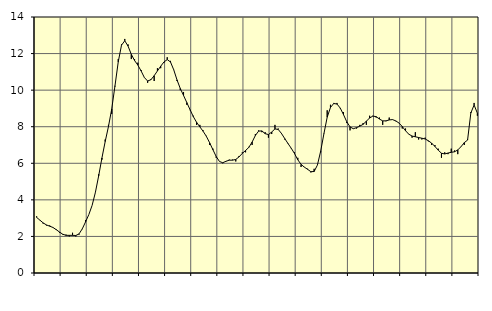
| Category | Piggar | Series 1 |
|---|---|---|
| nan | 3.1 | 3.04 |
| 87.0 | 2.9 | 2.89 |
| 87.0 | 2.7 | 2.74 |
| 87.0 | 2.6 | 2.63 |
| nan | 2.6 | 2.56 |
| 88.0 | 2.5 | 2.49 |
| 88.0 | 2.4 | 2.37 |
| 88.0 | 2.2 | 2.24 |
| nan | 2.1 | 2.12 |
| 89.0 | 2.1 | 2.06 |
| 89.0 | 2 | 2.06 |
| 89.0 | 2.2 | 2.06 |
| nan | 2 | 2.05 |
| 90.0 | 2.1 | 2.14 |
| 90.0 | 2.4 | 2.42 |
| 90.0 | 2.9 | 2.8 |
| nan | 3.2 | 3.2 |
| 91.0 | 3.7 | 3.7 |
| 91.0 | 4.4 | 4.41 |
| 91.0 | 5.4 | 5.31 |
| nan | 6.2 | 6.29 |
| 92.0 | 7.3 | 7.19 |
| 92.0 | 8.1 | 8.01 |
| 92.0 | 8.7 | 8.97 |
| nan | 10.2 | 10.24 |
| 93.0 | 11.7 | 11.55 |
| 93.0 | 12.5 | 12.46 |
| 93.0 | 12.8 | 12.7 |
| nan | 12.5 | 12.41 |
| 94.0 | 11.7 | 11.96 |
| 94.0 | 11.7 | 11.62 |
| 94.0 | 11.5 | 11.37 |
| nan | 11.1 | 11.05 |
| 95.0 | 10.7 | 10.69 |
| 95.0 | 10.4 | 10.5 |
| 95.0 | 10.6 | 10.57 |
| nan | 10.5 | 10.79 |
| 96.0 | 11.2 | 11.05 |
| 96.0 | 11.2 | 11.31 |
| 96.0 | 11.5 | 11.54 |
| nan | 11.8 | 11.67 |
| 97.0 | 11.6 | 11.54 |
| 97.0 | 11.1 | 11.11 |
| 97.0 | 10.5 | 10.56 |
| nan | 10 | 10.09 |
| 98.0 | 9.9 | 9.71 |
| 98.0 | 9.2 | 9.32 |
| 98.0 | 8.9 | 8.93 |
| nan | 8.6 | 8.55 |
| 99.0 | 8.1 | 8.24 |
| 99.0 | 8.1 | 7.99 |
| 99.0 | 7.8 | 7.75 |
| nan | 7.5 | 7.47 |
| 0.0 | 7 | 7.12 |
| 0.0 | 6.8 | 6.74 |
| 0.0 | 6.3 | 6.37 |
| nan | 6.1 | 6.1 |
| 1.0 | 6 | 6.03 |
| 1.0 | 6.1 | 6.11 |
| 1.0 | 6.2 | 6.17 |
| nan | 6.2 | 6.17 |
| 2.0 | 6.1 | 6.21 |
| 2.0 | 6.4 | 6.35 |
| 2.0 | 6.6 | 6.54 |
| nan | 6.6 | 6.7 |
| 3.0 | 6.9 | 6.87 |
| 3.0 | 7 | 7.16 |
| 3.0 | 7.6 | 7.52 |
| nan | 7.8 | 7.76 |
| 4.0 | 7.7 | 7.77 |
| 4.0 | 7.7 | 7.62 |
| 4.0 | 7.4 | 7.57 |
| nan | 7.6 | 7.71 |
| 5.0 | 8.1 | 7.88 |
| 5.0 | 7.9 | 7.85 |
| 5.0 | 7.6 | 7.63 |
| nan | 7.3 | 7.35 |
| 6.0 | 7.1 | 7.08 |
| 6.0 | 6.8 | 6.82 |
| 6.0 | 6.6 | 6.53 |
| nan | 6.3 | 6.19 |
| 7.0 | 5.8 | 5.94 |
| 7.0 | 5.8 | 5.79 |
| 7.0 | 5.7 | 5.67 |
| nan | 5.5 | 5.54 |
| 8.0 | 5.7 | 5.55 |
| 8.0 | 5.9 | 5.9 |
| 8.0 | 6.6 | 6.66 |
| nan | 7.6 | 7.62 |
| 9.0 | 8.9 | 8.52 |
| 9.0 | 9.2 | 9.05 |
| 9.0 | 9.3 | 9.27 |
| nan | 9.3 | 9.24 |
| 10.0 | 9 | 9.02 |
| 10.0 | 8.8 | 8.66 |
| 10.0 | 8.2 | 8.27 |
| nan | 7.8 | 7.99 |
| 11.0 | 7.9 | 7.89 |
| 11.0 | 7.9 | 7.95 |
| 11.0 | 8.1 | 8.03 |
| nan | 8.2 | 8.13 |
| 12.0 | 8.1 | 8.3 |
| 12.0 | 8.6 | 8.48 |
| 12.0 | 8.6 | 8.58 |
| nan | 8.5 | 8.55 |
| 13.0 | 8.5 | 8.42 |
| 13.0 | 8.1 | 8.32 |
| 13.0 | 8.3 | 8.32 |
| nan | 8.5 | 8.37 |
| 14.0 | 8.4 | 8.39 |
| 14.0 | 8.3 | 8.32 |
| 14.0 | 8.2 | 8.2 |
| nan | 7.9 | 8.01 |
| 15.0 | 7.9 | 7.78 |
| 15.0 | 7.6 | 7.59 |
| 15.0 | 7.4 | 7.49 |
| nan | 7.7 | 7.45 |
| 16.0 | 7.3 | 7.41 |
| 16.0 | 7.3 | 7.37 |
| 16.0 | 7.4 | 7.33 |
| nan | 7.2 | 7.23 |
| 17.0 | 7 | 7.1 |
| 17.0 | 7 | 6.92 |
| 17.0 | 6.8 | 6.72 |
| nan | 6.3 | 6.55 |
| 18.0 | 6.6 | 6.51 |
| 18.0 | 6.5 | 6.56 |
| 18.0 | 6.8 | 6.6 |
| nan | 6.7 | 6.63 |
| 19.0 | 6.5 | 6.73 |
| 19.0 | 6.9 | 6.91 |
| 19.0 | 7 | 7.13 |
| nan | 7.3 | 7.27 |
| 20.0 | 8.8 | 8.75 |
| 20.0 | 9.3 | 9.19 |
| 20.0 | 8.6 | 8.74 |